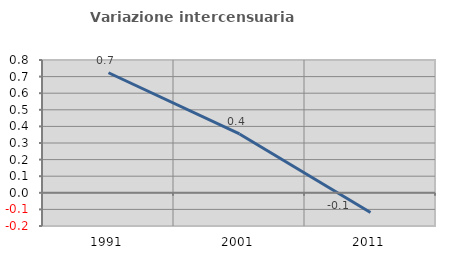
| Category | Variazione intercensuaria annua |
|---|---|
| 1991.0 | 0.723 |
| 2001.0 | 0.354 |
| 2011.0 | -0.119 |